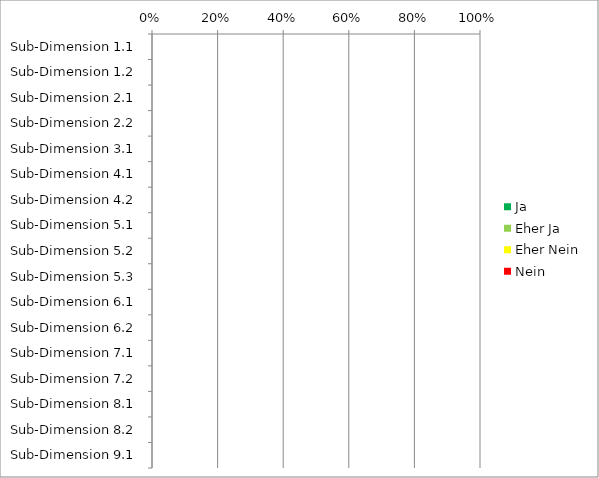
| Category | Ja | Eher Ja | Eher Nein | Nein |
|---|---|---|---|---|
| Sub-Dimension 1.1 | 0 | 0 | 0 | 0 |
| Sub-Dimension 1.2 | 0 | 0 | 0 | 0 |
| Sub-Dimension 2.1 | 0 | 0 | 0 | 0 |
| Sub-Dimension 2.2 | 0 | 0 | 0 | 0 |
| Sub-Dimension 3.1 | 0 | 0 | 0 | 0 |
| Sub-Dimension 4.1 | 0 | 0 | 0 | 0 |
| Sub-Dimension 4.2 | 0 | 0 | 0 | 0 |
| Sub-Dimension 5.1 | 0 | 0 | 0 | 0 |
| Sub-Dimension 5.2 | 0 | 0 | 0 | 0 |
| Sub-Dimension 5.3 | 0 | 0 | 0 | 0 |
| Sub-Dimension 6.1 | 0 | 0 | 0 | 0 |
| Sub-Dimension 6.2 | 0 | 0 | 0 | 0 |
| Sub-Dimension 7.1 | 0 | 0 | 0 | 0 |
| Sub-Dimension 7.2 | 0 | 0 | 0 | 0 |
| Sub-Dimension 8.1 | 0 | 0 | 0 | 0 |
| Sub-Dimension 8.2 | 0 | 0 | 0 | 0 |
| Sub-Dimension 9.1 | 0 | 0 | 0 | 0 |